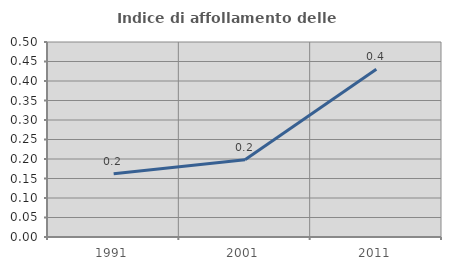
| Category | Indice di affollamento delle abitazioni  |
|---|---|
| 1991.0 | 0.162 |
| 2001.0 | 0.198 |
| 2011.0 | 0.43 |